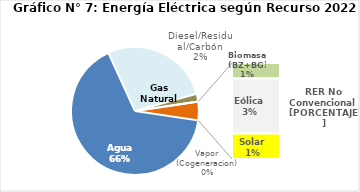
| Category | Series 0 |
|---|---|
| Agua | 3320.941 |
| Gas Natural | 1387.662 |
| Diesel/Residual/Carbón | 99.977 |
| Vapor (Cogeneracion) | 0.2 |
| Biomasa (BZ+BG) | 38.321 |
| Eólica | 136.396 |
| Solar | 63.608 |